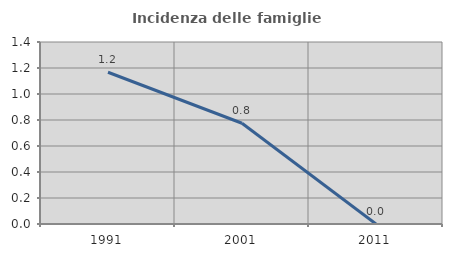
| Category | Incidenza delle famiglie numerose |
|---|---|
| 1991.0 | 1.167 |
| 2001.0 | 0.775 |
| 2011.0 | 0 |